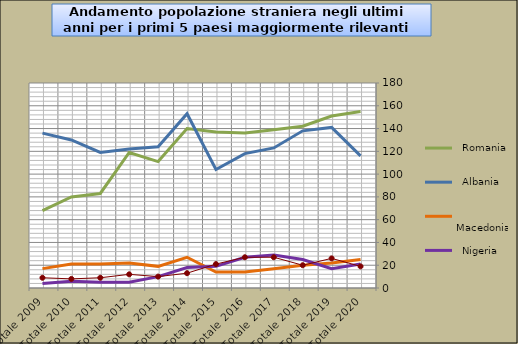
| Category |  Romania  |  Albania  |  Macedonia  |  Nigeria  |  Marocco  |
|---|---|---|---|---|---|
| Totale 2020 | 155 | 116 | 25 | 21 | 19 |
| Totale 2019 | 151 | 141 | 22 | 17 | 26 |
| Totale 2018 | 142 | 138 | 20 | 25 | 20 |
| Totale 2017 | 139 | 123 | 17 | 29 | 27 |
| Totale 2016 | 136 | 118 | 14 | 27 | 27 |
| Totale 2015 | 137 | 104 | 14 | 19 | 21 |
| Totale 2014 | 140 | 153 | 27 | 18 | 13 |
| Totale 2013 | 111 | 124 | 19 | 10 | 10 |
| Totale 2012 | 119 | 122 | 22 | 5 | 12 |
| Totale 2011 | 83 | 119 | 21 | 5 | 9 |
| Totale 2010 | 80 | 130 | 21 | 6 | 8 |
| Totale 2009 | 68 | 136 | 17 | 4 | 9 |